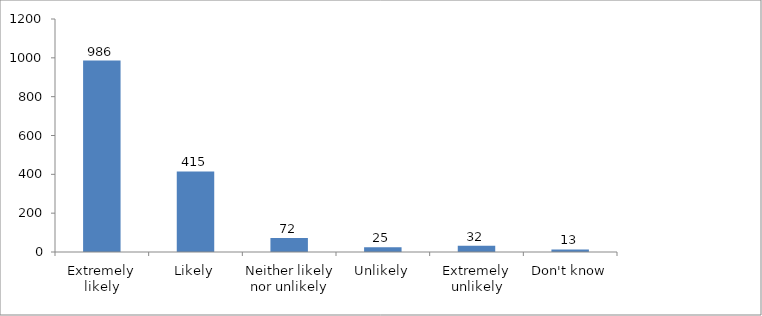
| Category | Series 0 |
|---|---|
| Extremely likely | 986 |
| Likely | 415 |
| Neither likely nor unlikely | 72 |
| Unlikely | 25 |
| Extremely unlikely | 32 |
| Don't know | 13 |